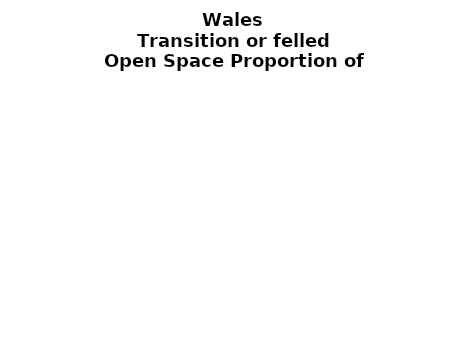
| Category | Transition or felled |
|---|---|
|  ≥ 10ha, < 10%  | 0.178 |
|   ≥ 10ha, 10-25% | 0.06 |
|   ≥ 10ha, > 25 and <50%  | 0.197 |
|   ≥ 10ha, ≥ 50%  | 0.473 |
|  < 10ha, < 10% | 0 |
|  < 10ha, 10-25% | 0.011 |
|  < 10ha, > 25 and < 50% | 0.004 |
|  < 10ha, ≥ 50% | 0.078 |